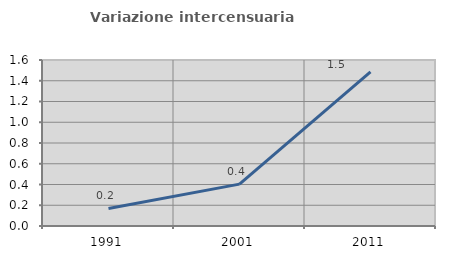
| Category | Variazione intercensuaria annua |
|---|---|
| 1991.0 | 0.169 |
| 2001.0 | 0.404 |
| 2011.0 | 1.486 |